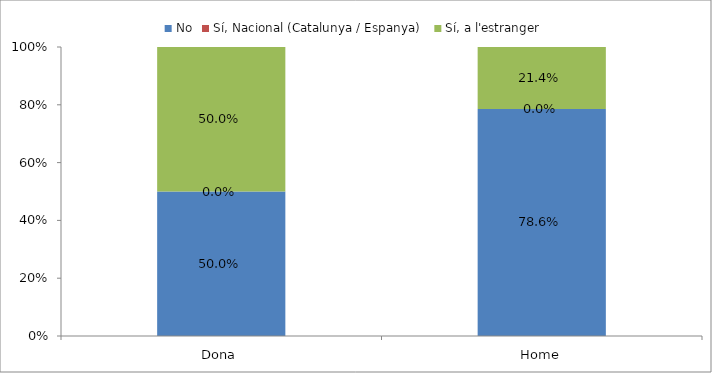
| Category | No | Sí, Nacional (Catalunya / Espanya) | Sí, a l'estranger |
|---|---|---|---|
| Dona | 0.5 | 0 | 0.5 |
| Home | 0.786 | 0 | 0.214 |